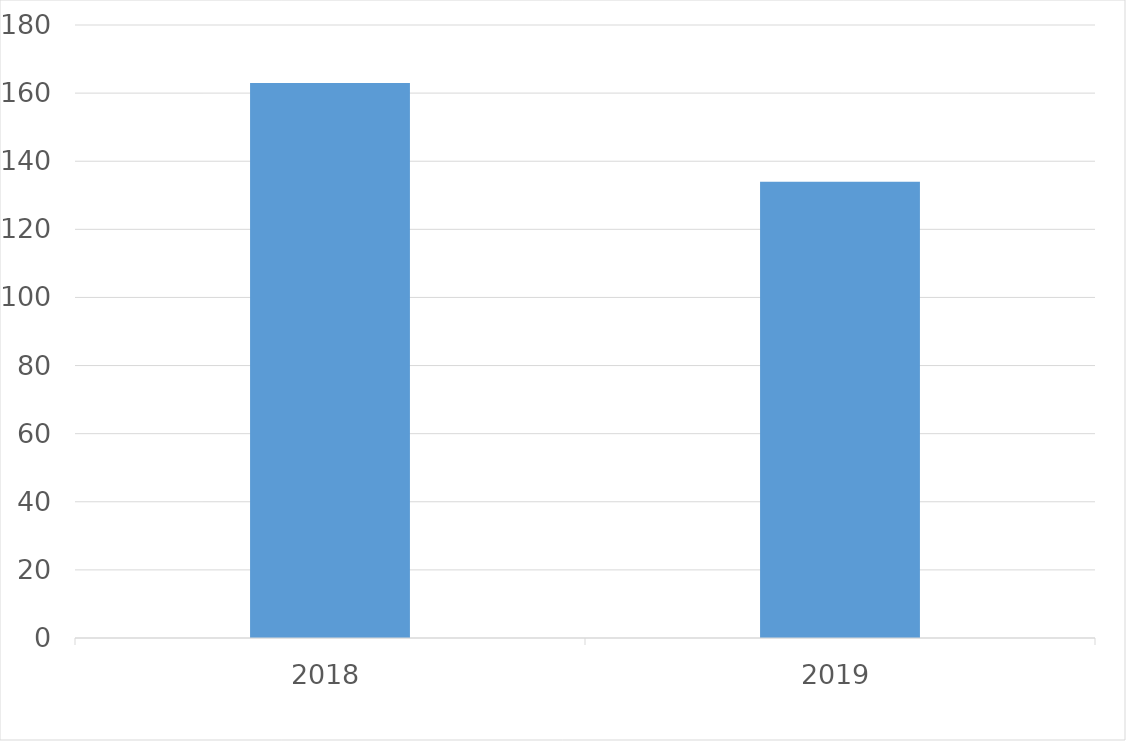
| Category | Series 0 |
|---|---|
| 2018 | 163 |
| 2019 | 134 |